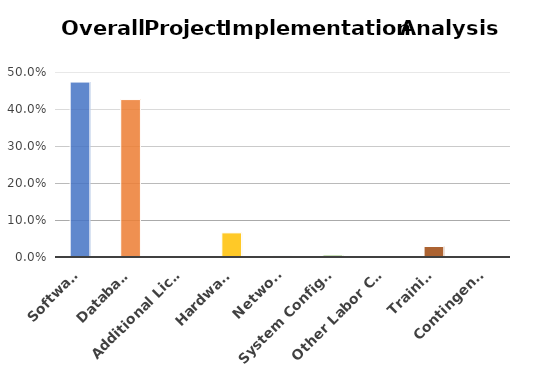
| Category | Series 0 |
|---|---|
| Software | 0.473 |
| Database | 0.425 |
| Additional Licenses | 0 |
| Hardware | 0.065 |
| Network | 0.003 |
| System Configuration | 0.005 |
| Other Labor Costs | 0 |
| Training | 0.028 |
| Contingency | 0 |